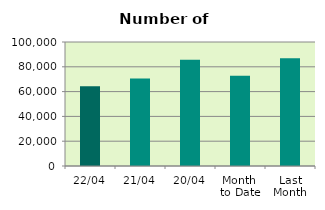
| Category | Series 0 |
|---|---|
| 22/04 | 64414 |
| 21/04 | 70522 |
| 20/04 | 85738 |
| Month 
to Date | 72716.571 |
| Last
Month | 86968.783 |